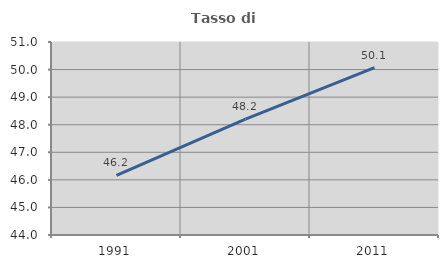
| Category | Tasso di occupazione   |
|---|---|
| 1991.0 | 46.164 |
| 2001.0 | 48.2 |
| 2011.0 | 50.074 |